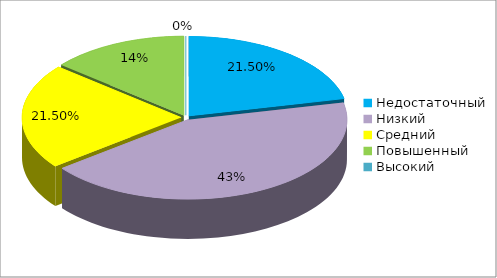
| Category | Series 0 |
|---|---|
| Недостаточный | 0.215 |
| Низкий | 0.43 |
| Средний | 0.215 |
| Повышенный | 0.14 |
| Высокий | 0 |